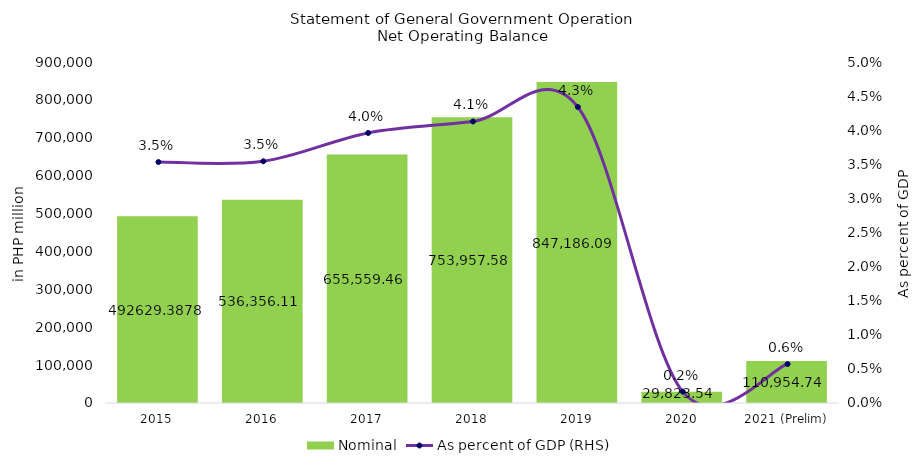
| Category | Nominal |
|---|---|
| 2015 | 492629.388 |
| 2016 | 536356.11 |
| 2017 | 655559.457 |
| 2018 | 753957.583 |
| 2019 | 847186.085 |
| 2020 | 29823.536 |
| 2021 (Prelim) | 110954.743 |